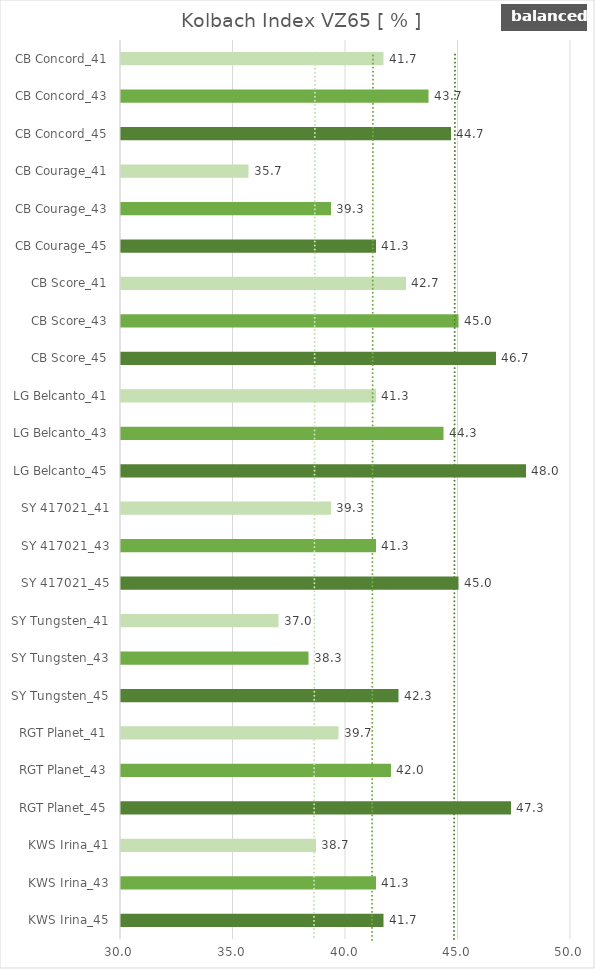
| Category |   Kolbach Index VZ65 [ % ] |
|---|---|
| KWS Irina_45 | 41.667 |
| KWS Irina_43 | 41.333 |
| KWS Irina_41 | 38.667 |
| RGT Planet_45 | 47.333 |
| RGT Planet_43 | 42 |
| RGT Planet_41 | 39.667 |
| SY Tungsten_45 | 42.333 |
| SY Tungsten_43 | 38.333 |
| SY Tungsten_41 | 37 |
| SY 417021_45 | 45 |
| SY 417021_43 | 41.333 |
| SY 417021_41 | 39.333 |
| LG Belcanto_45 | 48 |
| LG Belcanto_43 | 44.333 |
| LG Belcanto_41 | 41.333 |
| CB Score_45 | 46.667 |
| CB Score_43 | 45 |
| CB Score_41 | 42.667 |
| CB Courage_45 | 41.333 |
| CB Courage_43 | 39.333 |
| CB Courage_41 | 35.667 |
| CB Concord_45 | 44.667 |
| CB Concord_43 | 43.667 |
| CB Concord_41 | 41.667 |